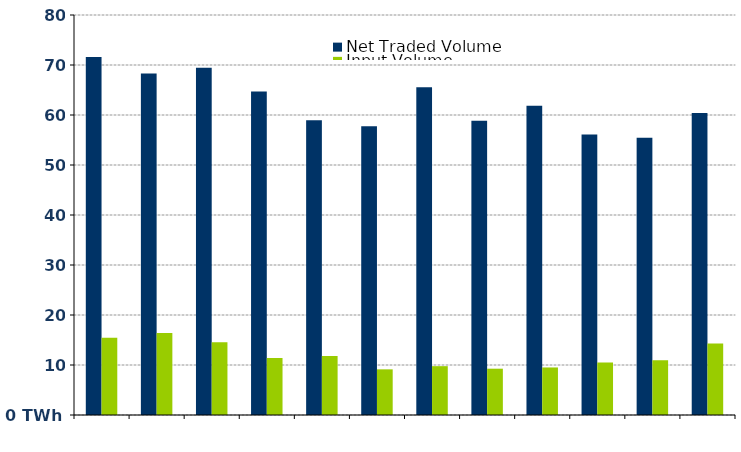
| Category | Net Traded Volume | Input Volume |
|---|---|---|
| 0 | 71.624 | 15.446 |
| 1900-01-01 | 68.279 | 16.418 |
| 1900-01-02 | 69.436 | 14.556 |
| 1900-01-03 | 64.679 | 11.394 |
| 1900-01-04 | 58.948 | 11.794 |
| 1900-01-05 | 57.757 | 9.13 |
| 1900-01-06 | 65.544 | 9.768 |
| 1900-01-07 | 58.849 | 9.261 |
| 1900-01-08 | 61.827 | 9.507 |
| 1900-01-09 | 56.119 | 10.478 |
| 1900-01-10 | 55.448 | 10.934 |
| 1900-01-11 | 60.389 | 14.296 |